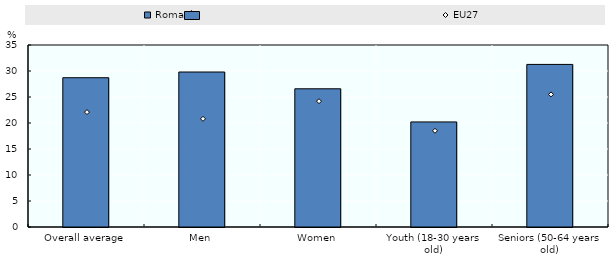
| Category | Romania |
|---|---|
| Overall average | 28.705 |
| Men | 29.806 |
| Women | 26.579 |
| Youth (18-30 years old) | 20.207 |
| Seniors (50-64 years old) | 31.268 |